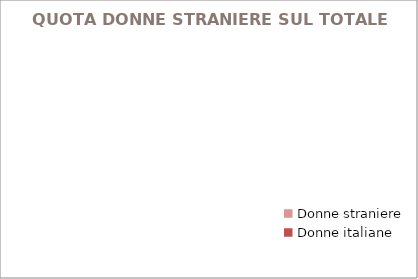
| Category | QUOTA DONNE STRANIERE SUL TOTALE DONNE -  |
|---|---|
| Donne straniere | 0 |
| Donne italiane | 0 |